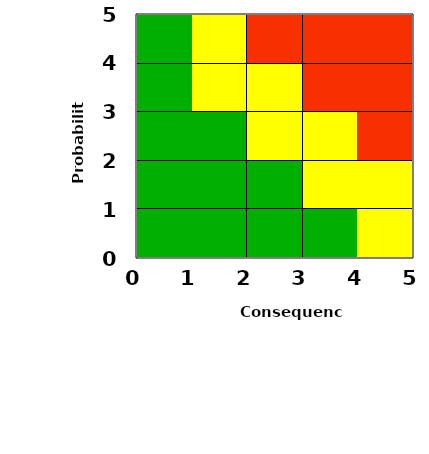
| Category | Series 0 |
|---|---|
| 2.533333333333333 | 0 |